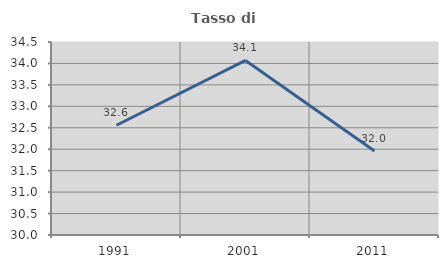
| Category | Tasso di occupazione   |
|---|---|
| 1991.0 | 32.559 |
| 2001.0 | 34.07 |
| 2011.0 | 31.957 |